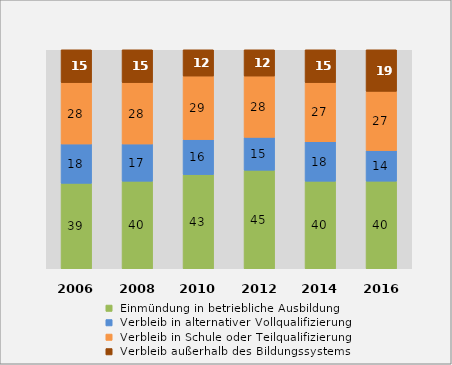
| Category |  Einmündung in betriebliche Ausbildung |  Verbleib in alternativer Vollqualifizierung |  Verbleib in Schule oder Teilqualifizierung |  Verbleib außerhalb des Bildungssystems |
|---|---|---|---|---|
| 2006.0 | 39 | 18 | 28 | 15 |
| 2008.0 | 40 | 17 | 28 | 15 |
| 2010.0 | 43 | 16 | 29 | 12 |
| 2012.0 | 45 | 15 | 28 | 12 |
| 2014.0 | 40 | 18 | 27 | 15 |
| 2016.0 | 40 | 14 | 27 | 19 |